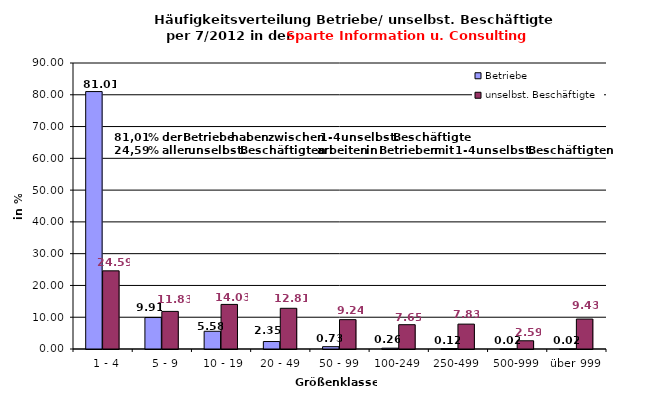
| Category | Betriebe | unselbst. Beschäftigte |
|---|---|---|
|   1 - 4 | 81.012 | 24.591 |
|   5 - 9 | 9.906 | 11.833 |
|  10 - 19 | 5.576 | 14.03 |
| 20 - 49 | 2.353 | 12.811 |
| 50 - 99 | 0.729 | 9.238 |
| 100-249 | 0.259 | 7.646 |
| 250-499 | 0.118 | 7.83 |
| 500-999 | 0.024 | 2.591 |
| über 999 | 0.024 | 9.43 |